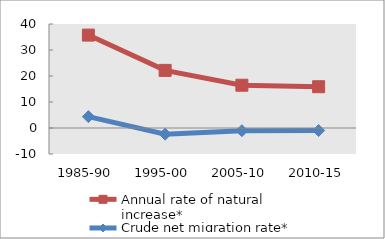
| Category | Annual rate of natural increase* | Crude net migration rate* |
|---|---|---|
| 1985-90 | 35.732 | 4.374 |
| 1995-00 | 22.157 | -2.368 |
| 2005-10 | 16.451 | -1.044 |
| 2010-15 | 15.875 | -0.968 |